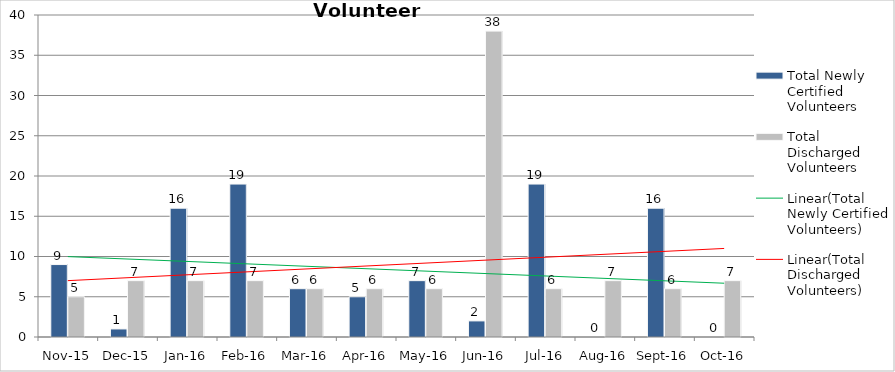
| Category | Total Newly Certified Volunteers | Total Discharged Volunteers |
|---|---|---|
| Nov-15 | 9 | 5 |
| Dec-15 | 1 | 7 |
| Jan-16 | 16 | 7 |
| Feb-16 | 19 | 7 |
| Mar-16 | 6 | 6 |
| Apr-16 | 5 | 6 |
| May-16 | 7 | 6 |
| Jun-16 | 2 | 38 |
| Jul-16 | 19 | 6 |
| Aug-16 | 0 | 7 |
| Sep-16 | 16 | 6 |
| Oct-16 | 0 | 7 |